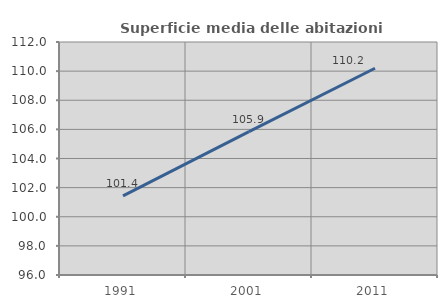
| Category | Superficie media delle abitazioni occupate |
|---|---|
| 1991.0 | 101.434 |
| 2001.0 | 105.851 |
| 2011.0 | 110.199 |